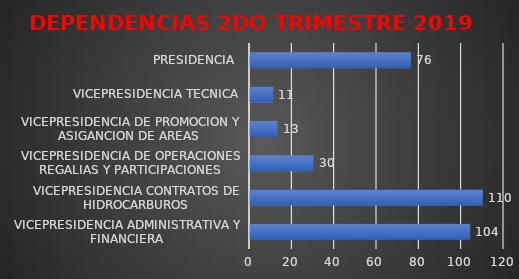
| Category | Series 0 |
|---|---|
| VICEPRESIDENCIA ADMINISTRATIVA Y FINANCIERA | 104 |
| VICEPRESIDENCIA CONTRATOS DE HIDROCARBUROS | 110 |
| VICEPRESIDENCIA DE OPERACIONES REGALIAS Y PARTICIPACIONES | 30 |
| VICEPRESIDENCIA DE PROMOCION Y ASIGANCION DE AREAS  | 13 |
| VICEPRESIDENCIA TECNICA | 11 |
| PRESIDENCIA  | 76 |